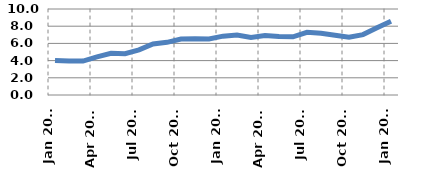
| Category | Series 0 |
|---|---|
| 2013-01-01 | 4 |
| 2013-02-01 | 3.94 |
| 2013-03-01 | 3.949 |
| 2013-04-01 | 4.433 |
| 2013-05-01 | 4.854 |
| 2013-06-01 | 4.801 |
| 2013-07-01 | 5.246 |
| 2013-08-01 | 5.942 |
| 2013-09-01 | 6.123 |
| 2013-10-01 | 6.517 |
| 2013-11-01 | 6.549 |
| 2013-12-01 | 6.517 |
| 2014-01-01 | 6.843 |
| 2014-02-01 | 6.982 |
| 2014-03-01 | 6.699 |
| 2014-04-01 | 6.904 |
| 2014-05-01 | 6.809 |
| 2014-06-01 | 6.771 |
| 2014-07-01 | 7.286 |
| 2014-08-01 | 7.175 |
| 2014-09-01 | 6.955 |
| 2014-10-01 | 6.724 |
| 2014-11-01 | 7.022 |
| 2014-12-01 | 7.812 |
| 2015-01-01 | 8.572 |